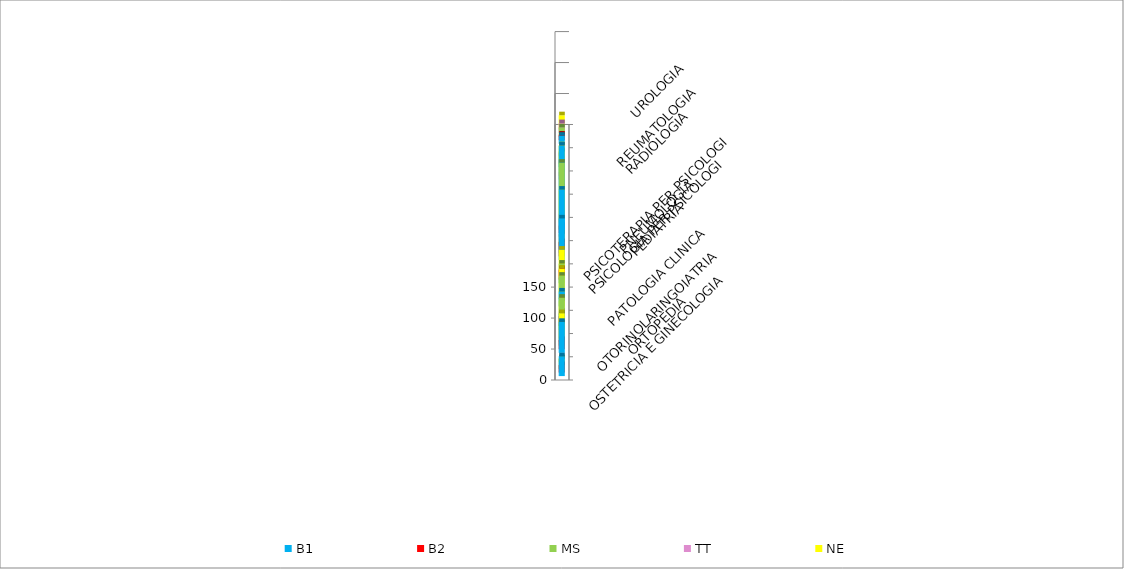
| Category | B1 | B2 | MS | TT | NE |
|---|---|---|---|---|---|
| ORTOPEDIA | 32 | 12 | 16 | 0 | 6 |
| OSTETRICIA E GINECOLOGIA | 50 | 15 | 36 | 21 | 41 |
| OTORINOLARINGOIATRIA | 26 | 16 | 40 | 12 | 24 |
| PATOLOGIA CLINICA | 24 | 0 | 38 | 0 | 38 |
| PEDIATRIA | 9 | 16 | 20 | 6 | 31 |
| PNEUMOLOGIA | 67 | 23 | 31 | 24 | 8 |
| PSICOLOGIA PER PSICOLOGI | 76 | 12 | 108 | 19 | 51 |
| PSICOTERAPIA PER PSICOLOGI | 0 | 0 | 0 | 0 | 0 |
| RADIOLOGIA | 72 | 0 | 0 | 12 | 40 |
| REUMATOLOGIA | 12 | 6 | 12 | 6 | 12 |
| UROLOGIA | 13 | 9 | 15 | 16 | 23 |